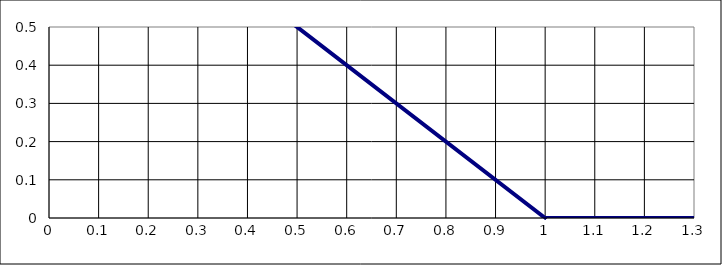
| Category | Series 0 |
|---|---|
| 0.9999999999999999 | 0 |
| 1.7999999999999998 | 0 |
| 2.8 | 1 |
| 0.0 | 1 |
| 0.9999999999999999 | 0 |